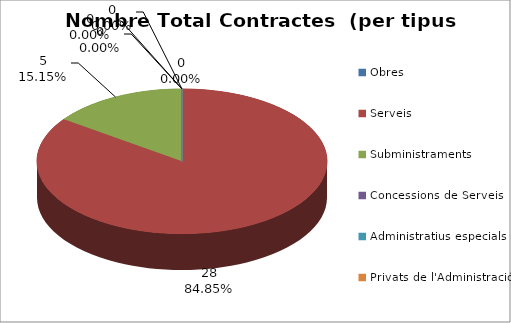
| Category | Nombre Total Contractes |
|---|---|
| Obres | 0 |
| Serveis | 28 |
| Subministraments | 5 |
| Concessions de Serveis | 0 |
| Administratius especials | 0 |
| Privats de l'Administració | 0 |